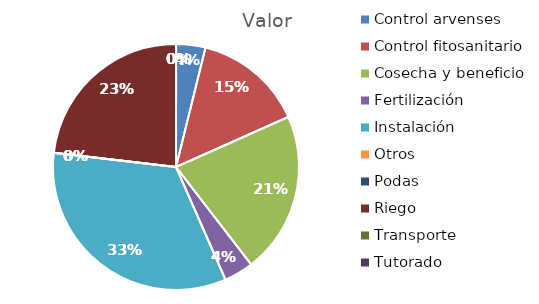
| Category | Valor |
|---|---|
| Control arvenses | 200000 |
| Control fitosanitario | 750000 |
| Cosecha y beneficio | 1100000 |
| Fertilización | 200000 |
| Instalación | 1733048 |
| Otros | 0 |
| Podas | 0 |
| Riego | 1200000 |
| Transporte | 0 |
| Tutorado | 0 |